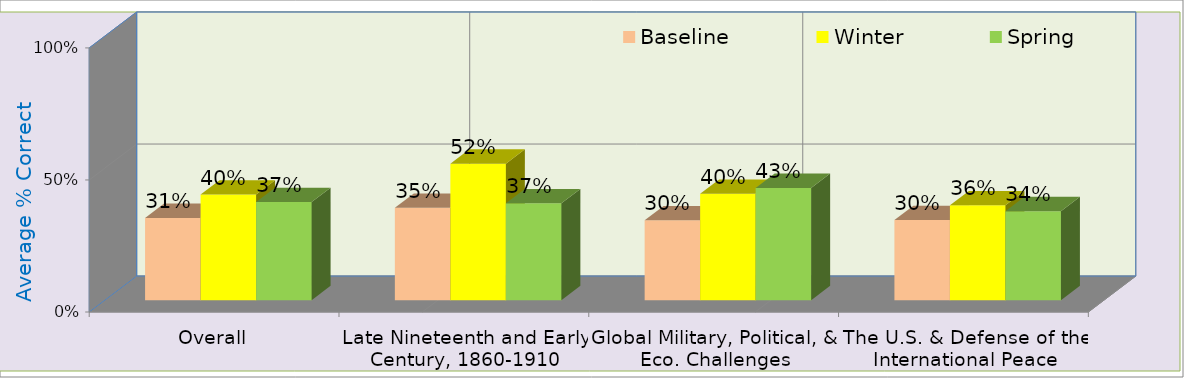
| Category | Baseline | Winter | Spring |
|---|---|---|---|
| Overall | 31.143 | 40.012 | 37.141 |
| Late Nineteenth and Early Century, 1860-1910 | 34.983 | 51.678 | 36.667 |
| Global Military, Political, & Eco. Challenges | 30.255 | 40.272 | 42.515 |
| The U.S. & Defense of the International Peace | 30.366 | 35.949 | 33.717 |